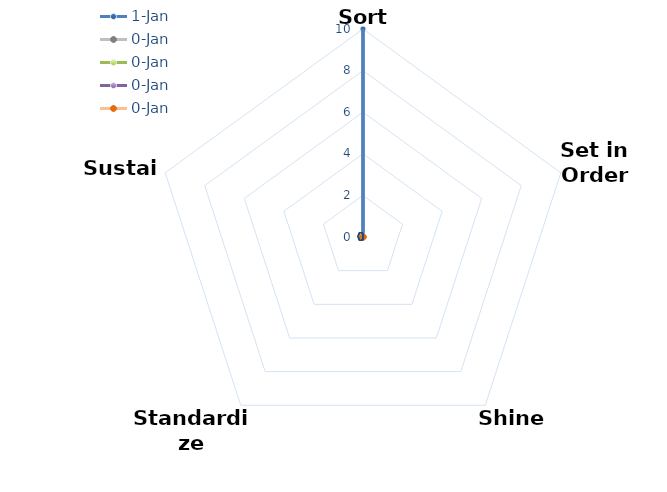
| Category | 1-Jan | 0-Jan |
|---|---|---|
| Sort | 10 | 0 |
| Set in Order | 0 | 0 |
| Shine | 0 | 0 |
| Standardize | 0 | 0 |
| Sustain | 0 | 0 |